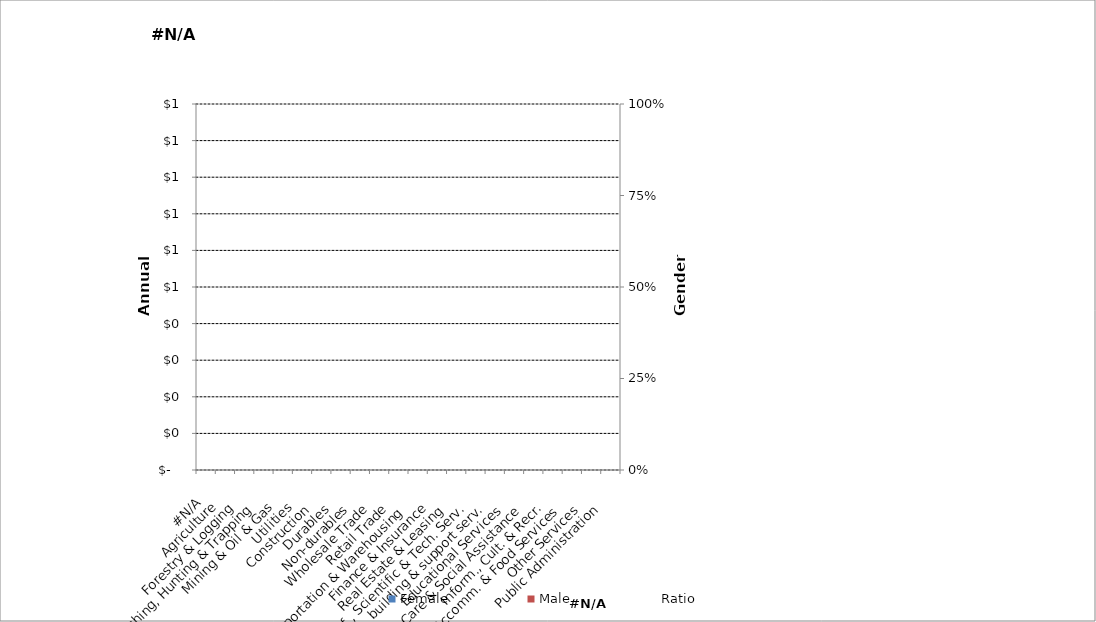
| Category | Female | Male |
|---|---|---|
|  #N/A  | 0 | 0 |
|  Agriculture   | 0 | 0 |
|  Forestry & Logging  | 0 | 0 |
|  Fishing, Hunting & Trapping   | 0 | 0 |
|  Mining & Oil & Gas  | 0 | 0 |
|  Utilities   | 0 | 0 |
|  Construction   | 0 | 0 |
|  Durables   | 0 | 0 |
|  Non-durables   | 0 | 0 |
|  Wholesale Trade   | 0 | 0 |
|  Retail Trade   | 0 | 0 |
|  Transportation & Warehousing   | 0 | 0 |
|  Finance & Insurance   | 0 | 0 |
|  Real Estate & Leasing   | 0 | 0 |
|  Prof., Scientific & Tech. Serv.  | 0 | 0 |
|  Bus., building & support serv.  | 0 | 0 |
|  Educational Services   | 0 | 0 |
|  Health Care & Social Assistance   | 0 | 0 |
|  Inform., Cult. & Recr.  | 0 | 0 |
|  Accomm. & Food Services   | 0 | 0 |
|  Other Services   | 0 | 0 |
|  Public Administration   | 0 | 0 |